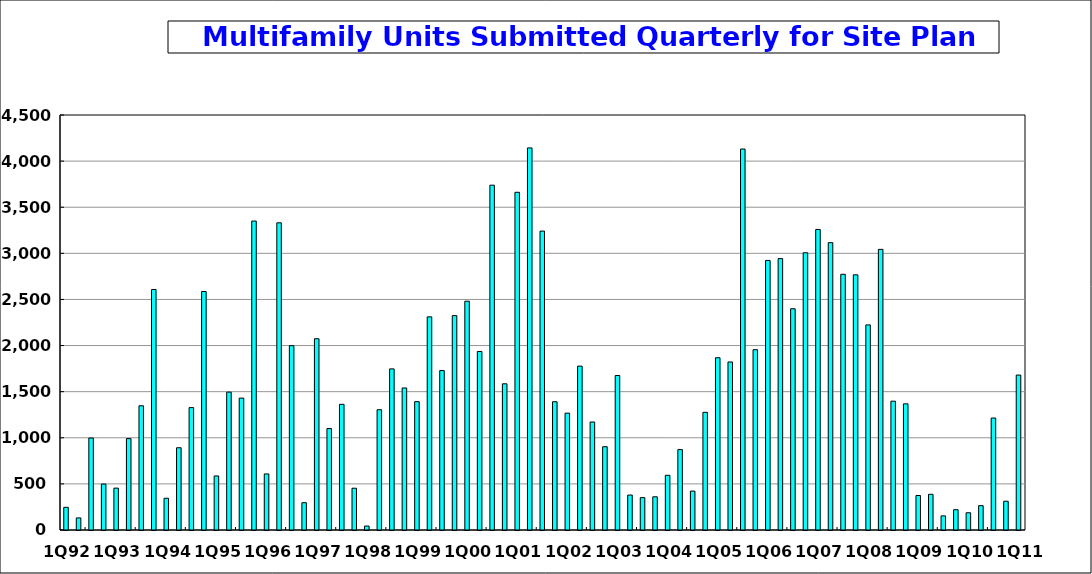
| Category | Series 0 |
|---|---|
| 1Q92 | 246 |
| 2Q92 | 131 |
| 3Q92 | 997 |
| 4Q92 | 498 |
| 1Q93 | 454 |
| 2Q93 | 991 |
| 3Q93 | 1347 |
| 4Q93 | 2608 |
| 1Q94 | 344 |
| 2Q94 | 892 |
| 3Q94 | 1327 |
| 4Q94 | 2586 |
| 1Q95 | 586 |
| 2Q95 | 1495 |
| 3Q95 | 1430 |
| 4Q95 | 3350 |
| 1Q96 | 608 |
| 2Q96 | 3331 |
| 3Q96 | 1999 |
| 4Q96 | 296 |
| 1Q97 | 2074 |
| 2Q97 | 1100 |
| 3Q97 | 1363 |
| 4Q97 | 453 |
| 1Q98 | 43 |
| 2Q98 | 1304 |
| 3Q98 | 1747 |
| 4Q98 | 1540 |
| 1Q99 | 1392 |
| 2Q99 | 2311 |
| 3Q99 | 1729 |
| 4Q99 | 2324.56 |
| 1Q00 | 2481 |
| 2Q00 | 1936 |
| 3Q00 | 3739 |
| 4Q00 | 1585 |
| 1Q01 | 3662 |
| 2Q01 | 4143 |
| 3Q01 | 3241 |
| 4Q01 | 1391 |
| 1Q02 | 1267 |
| 2Q02 | 1777 |
| 3Q02 | 1171 |
| 4Q02 | 903 |
| 1Q03 | 1675 |
| 2Q03 | 379 |
| 3Q03 | 351 |
| 4Q03 | 360 |
| 1Q04 | 593 |
| 2Q04 | 872 |
| 3Q04 | 422 |
| 4Q04 | 1276 |
| 1Q05 | 1868 |
| 2Q05 | 1822 |
| 3Q05 | 4131 |
| 4Q05 | 1955 |
| 1Q06 | 2923 |
| 2Q06 | 2943 |
| 3Q06 | 2399 |
| 4Q06 | 3006 |
| 1Q07 | 3259 |
| 2Q07 | 3116 |
| 3Q07 | 2773 |
| 4Q07 | 2767 |
| 1Q08 | 2224 |
| 2Q08 | 3043 |
| 3Q08 | 1397 |
| 4Q08 | 1368 |
| 1Q09 | 374 |
| 2Q09 | 387 |
| 3Q09 | 153 |
| 4Q09 | 220 |
| 1Q10 | 187 |
| 2Q10 | 264 |
| 3Q10 | 1214 |
| 4Q10 | 312 |
| 1Q11 | 1680 |